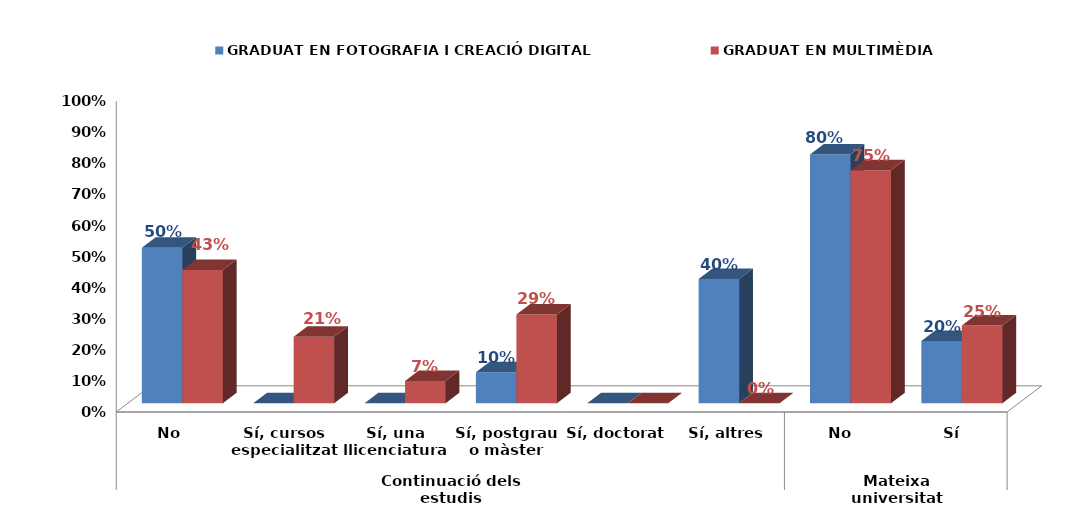
| Category | GRADUAT EN FOTOGRAFIA I CREACIÓ DIGITAL | GRADUAT EN MULTIMÈDIA |
|---|---|---|
| 0 | 0.5 | 0.429 |
| 1 | 0 | 0.214 |
| 2 | 0 | 0.071 |
| 3 | 0.1 | 0.286 |
| 4 | 0 | 0 |
| 5 | 0.4 | 0 |
| 6 | 0.8 | 0.75 |
| 7 | 0.2 | 0.25 |